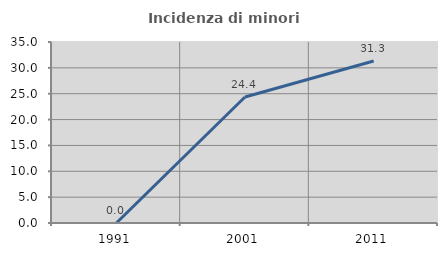
| Category | Incidenza di minori stranieri |
|---|---|
| 1991.0 | 0 |
| 2001.0 | 24.359 |
| 2011.0 | 31.325 |